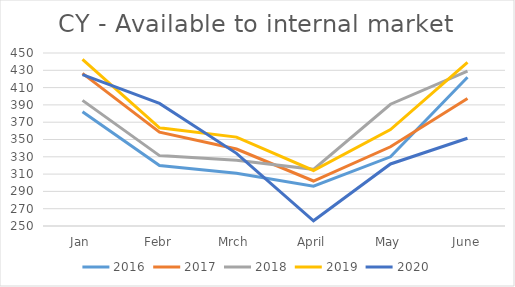
| Category | 2016 | 2017 | 2018 | 2019 | 2020 |
|---|---|---|---|---|---|
| Jan | 382 | 426.486 | 395.254 | 442.695 | 424.945 |
| Febr | 320 | 358.529 | 331.371 | 363.488 | 391.731 |
| Mrch | 311 | 339.013 | 325.887 | 352.777 | 334.005 |
| April | 296 | 302.027 | 315.499 | 314.17 | 256.017 |
| May | 330 | 341.594 | 390.76 | 361.543 | 321.727 |
| June | 422 | 397.436 | 428.927 | 439.07 | 351.466 |